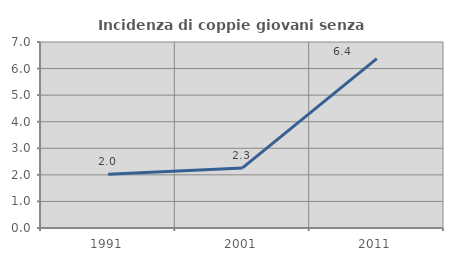
| Category | Incidenza di coppie giovani senza figli |
|---|---|
| 1991.0 | 2.02 |
| 2001.0 | 2.26 |
| 2011.0 | 6.373 |